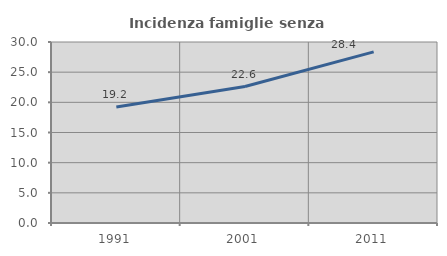
| Category | Incidenza famiglie senza nuclei |
|---|---|
| 1991.0 | 19.215 |
| 2001.0 | 22.621 |
| 2011.0 | 28.368 |